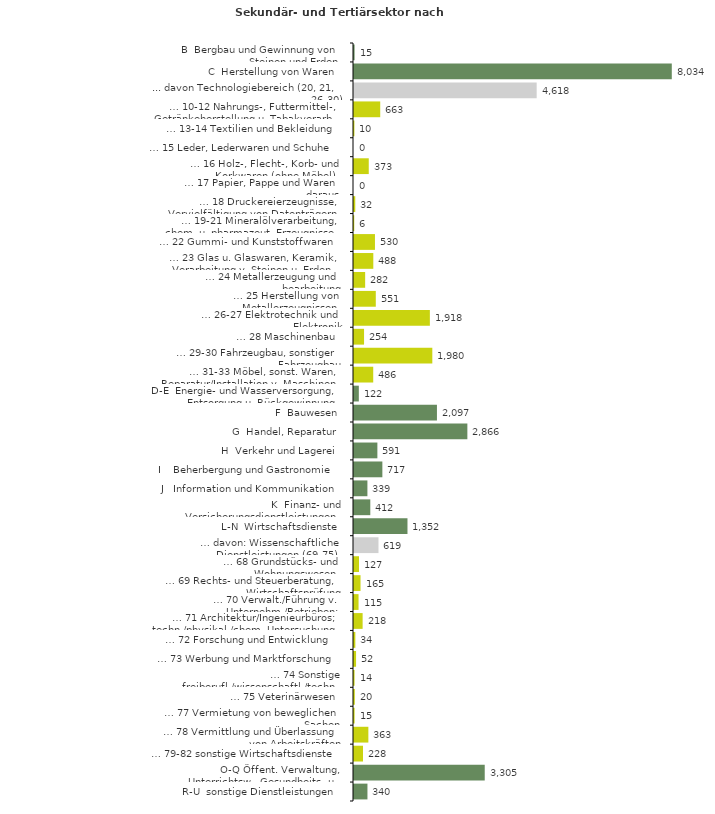
| Category | Series 0 |
|---|---|
| B  Bergbau und Gewinnung von Steinen und Erden | 15 |
| C  Herstellung von Waren | 8034 |
| ... davon Technologiebereich (20, 21, 26-30) | 4618 |
| … 10-12 Nahrungs-, Futtermittel-, Getränkeherstellung u. Tabakverarb. | 663 |
| … 13-14 Textilien und Bekleidung | 10 |
| … 15 Leder, Lederwaren und Schuhe | 0 |
| … 16 Holz-, Flecht-, Korb- und Korkwaren (ohne Möbel)  | 373 |
| … 17 Papier, Pappe und Waren daraus  | 0 |
| … 18 Druckereierzeugnisse, Vervielfältigung von Datenträgern | 32 |
| … 19-21 Mineralölverarbeitung, chem. u. pharmazeut. Erzeugnisse | 6 |
| … 22 Gummi- und Kunststoffwaren | 530 |
| … 23 Glas u. Glaswaren, Keramik, Verarbeitung v. Steinen u. Erden  | 488 |
| … 24 Metallerzeugung und -bearbeitung | 282 |
| … 25 Herstellung von Metallerzeugnissen  | 551 |
| … 26-27 Elektrotechnik und Elektronik | 1918 |
| … 28 Maschinenbau | 254 |
| … 29-30 Fahrzeugbau, sonstiger Fahrzeugbau | 1980 |
| … 31-33 Möbel, sonst. Waren, Reparatur/Installation v. Maschinen | 486 |
| D-E  Energie- und Wasserversorgung, Entsorgung u. Rückgewinnung | 122 |
| F  Bauwesen | 2097 |
| G  Handel, Reparatur | 2866 |
| H  Verkehr und Lagerei | 591 |
| I    Beherbergung und Gastronomie | 717 |
| J   Information und Kommunikation | 339 |
| K  Finanz- und Versicherungsdienstleistungen | 412 |
| L-N  Wirtschaftsdienste | 1352 |
| … davon: Wissenschaftliche Dienstleistungen (69-75) | 619 |
| … 68 Grundstücks- und Wohnungswesen  | 127 |
| … 69 Rechts- und Steuerberatung, Wirtschaftsprüfung | 165 |
| … 70 Verwalt./Führung v. Unternehm./Betrieben; Unternehmensberat. | 115 |
| … 71 Architektur/Ingenieurbüros; techn./physikal./chem. Untersuchung | 218 |
| … 72 Forschung und Entwicklung  | 34 |
| … 73 Werbung und Marktforschung | 52 |
| … 74 Sonstige freiberufl./wissenschaftl./techn. Tätigkeiten | 14 |
| … 75 Veterinärwesen | 20 |
| … 77 Vermietung von beweglichen Sachen  | 15 |
| … 78 Vermittlung und Überlassung von Arbeitskräften | 363 |
| … 79-82 sonstige Wirtschaftsdienste | 228 |
| O-Q Öffent. Verwaltung, Unterrichtsw., Gesundheits- u. Sozialwesen | 3305 |
| R-U  sonstige Dienstleistungen | 340 |